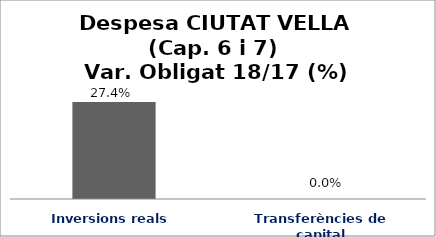
| Category | Series 0 |
|---|---|
| Inversions reals | 0.274 |
| Transferències de capital | 0 |